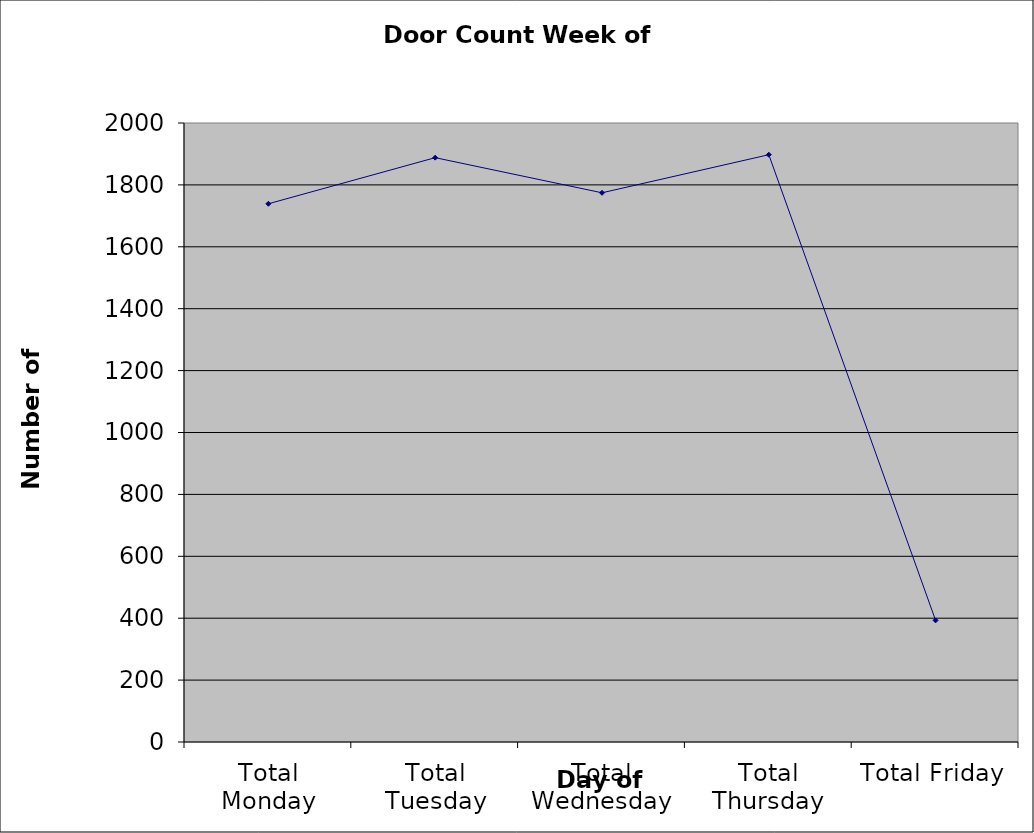
| Category | Series 0 |
|---|---|
| Total Monday | 1739 |
| Total Tuesday | 1888 |
| Total Wednesday | 1774.5 |
| Total Thursday | 1897.5 |
| Total Friday | 393 |